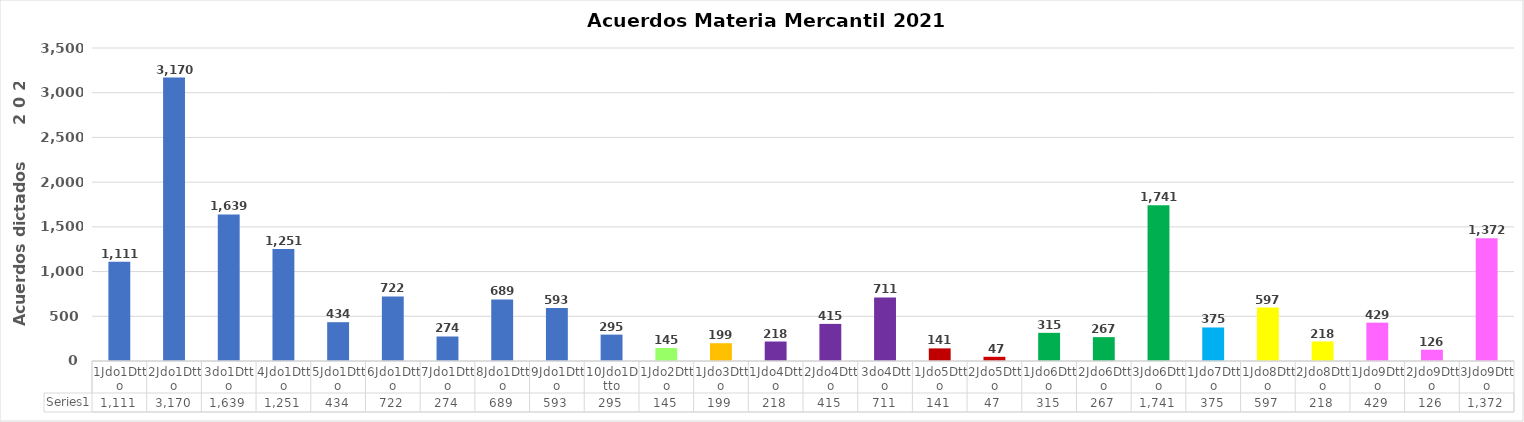
| Category | Series 0 |
|---|---|
| 1Jdo1Dtto | 1111 |
| 2Jdo1Dtto | 3170 |
| 3do1Dtto | 1639 |
| 4Jdo1Dtto | 1251 |
| 5Jdo1Dtto | 434 |
| 6Jdo1Dtto | 722 |
| 7Jdo1Dtto | 274 |
| 8Jdo1Dtto | 689 |
| 9Jdo1Dtto | 593 |
| 10Jdo1Dtto | 295 |
| 1Jdo2Dtto | 145 |
| 1Jdo3Dtto | 199 |
| 1Jdo4Dtto | 218 |
| 2Jdo4Dtto | 415 |
| 3do4Dtto | 711 |
| 1Jdo5Dtto | 141 |
| 2Jdo5Dtto | 47 |
| 1Jdo6Dtto | 315 |
| 2Jdo6Dtto | 267 |
| 3Jdo6Dtto | 1741 |
| 1Jdo7Dtto | 375 |
| 1Jdo8Dtto | 597 |
| 2Jdo8Dtto | 218 |
| 1Jdo9Dtto | 429 |
| 2Jdo9Dtto | 126 |
| 3Jdo9Dtto | 1372 |